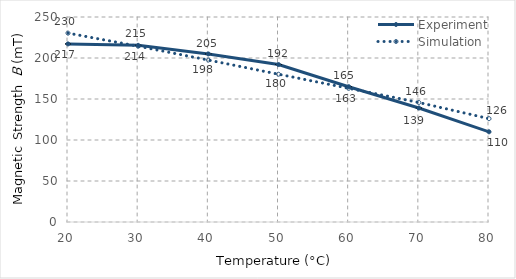
| Category | Experiment | Simulation |
|---|---|---|
| 20.0 | 217.2 | 230.32 |
| 30.0 | 215.4 | 214.37 |
| 40.0 | 205 | 197.5 |
| 50.0 | 192 | 180.22 |
| 60.0 | 165 | 163.07 |
| 70.0 | 139 | 145.77 |
| 80.0 | 110 | 126.05 |